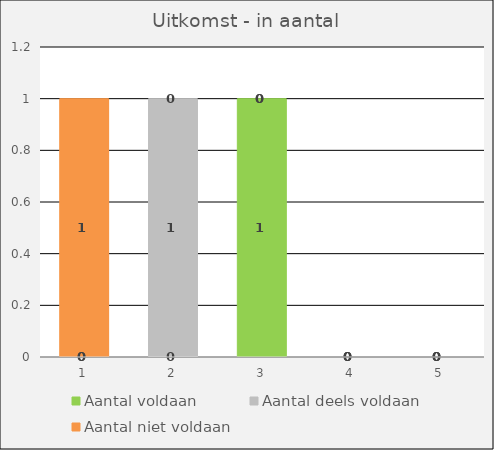
| Category | Aantal voldaan | Aantal deels voldaan | Aantal niet voldaan |
|---|---|---|---|
| 0 | 0 | 0 | 1 |
| 1 | 0 | 1 | 0 |
| 2 | 1 | 0 | 0 |
| 3 | 0 | 0 | 0 |
| 4 | 0 | 0 | 0 |